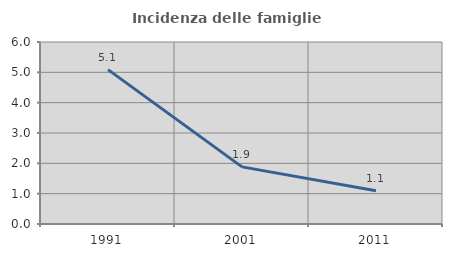
| Category | Incidenza delle famiglie numerose |
|---|---|
| 1991.0 | 5.089 |
| 2001.0 | 1.884 |
| 2011.0 | 1.093 |